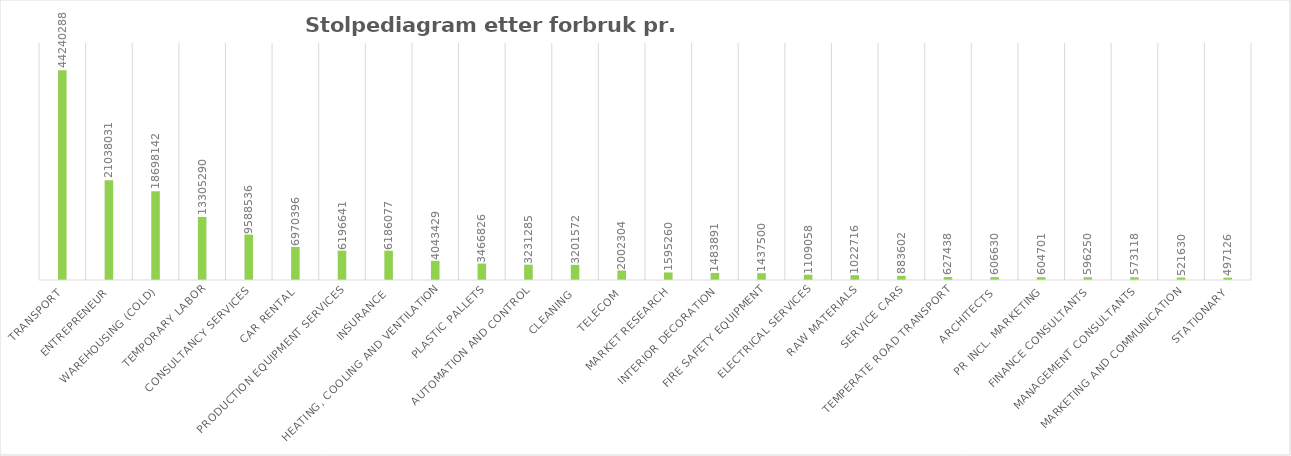
| Category | Series 0 |
|---|---|
| Transport | 44240287.62 |
| Entrepreneur | 21038030.55 |
| Warehousing (cold) | 18698141.74 |
| Temporary labor | 13305289.69 |
| Consultancy services | 9588536.25 |
| Car rental | 6970396.2 |
| Production Equipment Services | 6196640.62 |
| Insurance | 6186077 |
| Heating, cooling and ventilation | 4043428.5 |
| Plastic pallets | 3466825.61 |
| Automation and control | 3231284.71 |
| Cleaning | 3201572.01 |
| Telecom | 2002303.97 |
| Market Research | 1595259.58 |
| Interior decoration | 1483891.25 |
| Fire Safety Equipment | 1437500 |
| Electrical services | 1109058 |
| Raw materials | 1022715.53 |
| Service cars | 883601.89 |
| Temperate Road Transport | 627438.43 |
| Architects | 606630.15 |
| PR incl. marketing | 604701.25 |
| Finance Consultants | 596250 |
| Management consultants | 573118 |
| Marketing and communication | 521630.41 |
| Stationary | 497125.95 |